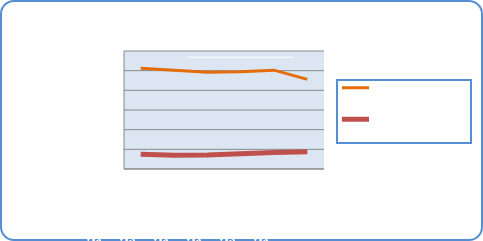
| Category | Motorin Türleri | Benzin Türleri |
|---|---|---|
| 2/11/19 | 51221334.182 | 7444774.255 |
| 2/12/19 | 50269896.188 | 7050438.199 |
| 2/13/19 | 49227591.511 | 7080161.427 |
| 2/14/19 | 49445148.089 | 7745563.104 |
| 2/15/19 | 50254300.035 | 8406852.025 |
| 2/16/19 | 45571051.994 | 8797758.279 |